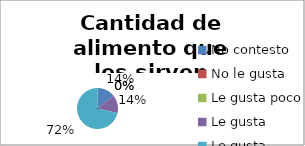
| Category | Series 0 |
|---|---|
| No contesto | 1 |
| No le gusta | 0 |
| Le gusta poco | 0 |
| Le gusta | 1 |
| Le gusta mucho | 5 |